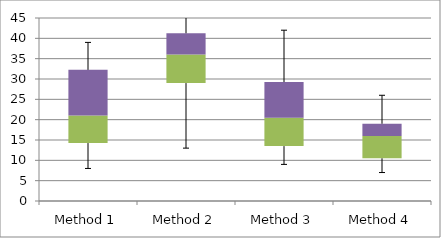
| Category | Min | Q1-Min | Med-Q1 | Q3-Med |
|---|---|---|---|---|
| Method 1 | 8 | 6.25 | 6.75 | 11.25 |
| Method 2 | 13 | 16 | 7 | 5.25 |
| Method 3 | 9 | 4.5 | 7 | 8.75 |
| Method 4 | 7 | 3.5 | 5.5 | 3 |